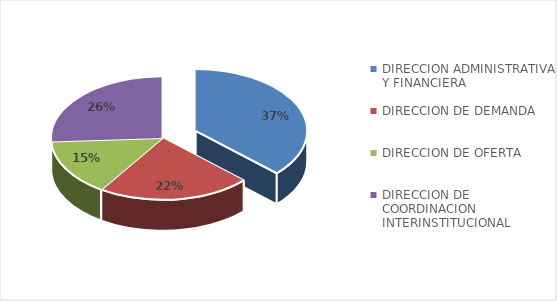
| Category | Series 0 |
|---|---|
| DIRECCION ADMINISTRATIVA Y FINANCIERA | 10 |
| DIRECCION DE DEMANDA | 6 |
| DIRECCION DE OFERTA | 4 |
| DIRECCION DE COORDINACION INTERINSTITUCIONAL | 7 |